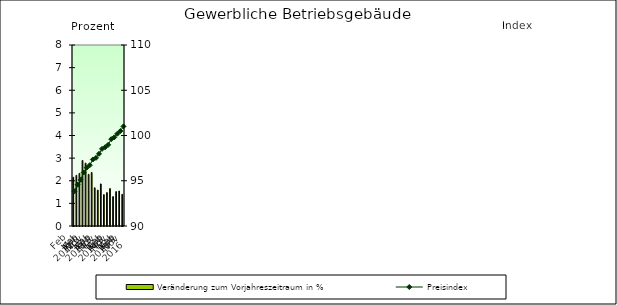
| Category | Veränderung zum Vorjahreszeitraum in % |
|---|---|
| 0 | 2.155 |
| 1 | 2.237 |
| 2 | 2.323 |
| 3 | 2.896 |
| 4 | 2.78 |
| 5 | 2.284 |
| 6 | 2.365 |
| 7 | 1.689 |
| 8 | 1.586 |
| 9 | 1.86 |
| 10 | 1.386 |
| 11 | 1.476 |
| 12 | 1.653 |
| 13 | 1.299 |
| 14 | 1.519 |
| 15 | 1.546 |
| 16 | 1.4 |